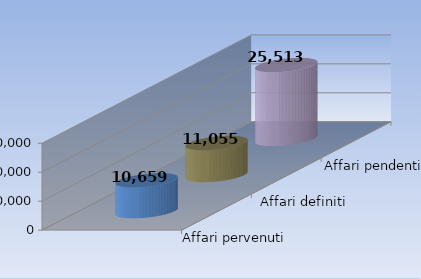
| Category | Affari pervenuti | Affari definiti | Affari pendenti |
|---|---|---|---|
| 0 | 10659 | 11055 | 25513 |